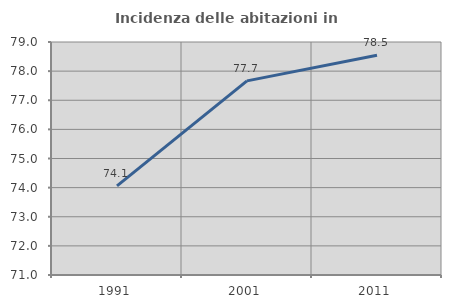
| Category | Incidenza delle abitazioni in proprietà  |
|---|---|
| 1991.0 | 74.06 |
| 2001.0 | 77.666 |
| 2011.0 | 78.543 |